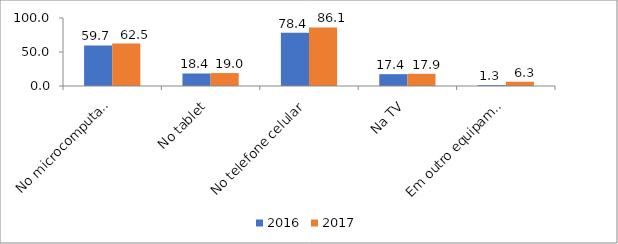
| Category | 2016 | 2017 |
|---|---|---|
| No microcomputador | 59.7 | 62.5 |
| No tablet | 18.4 | 19 |
| No telefone celular | 78.4 | 86.1 |
| Na TV | 17.4 | 17.9 |
| Em outro equipamento | 1.3 | 6.3 |